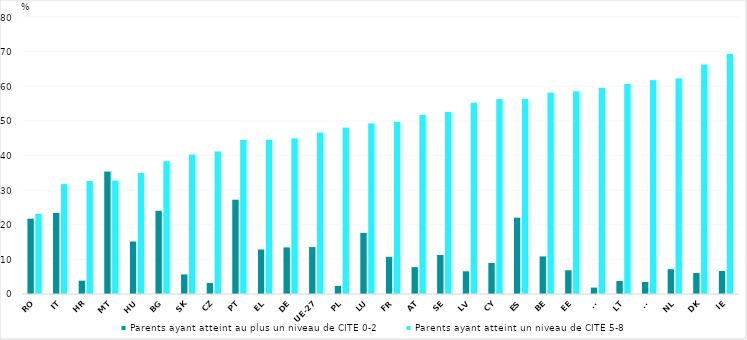
| Category | Parents ayant atteint au plus un niveau de CITE 0-2 | Parents ayant atteint un niveau de CITE 5-8 |
|---|---|---|
| RO | 21.9 | 23.3 |
| IT | 23.6 | 31.9 |
| HR | 4 | 32.8 |
| MT | 35.5 | 32.9 |
| HU | 15.3 | 35.1 |
| BG | 24.2 | 38.5 |
| SK | 5.8 | 40.4 |
| CZ | 3.3 | 41.3 |
| PT | 27.4 | 44.7 |
| EL | 13 | 44.7 |
| DE | 13.6 | 45.1 |
| UE-27 | 13.7 | 46.8 |
| PL | 2.5 | 48.2 |
| LU | 17.8 | 49.4 |
| FR | 10.9 | 49.9 |
| AT | 7.9 | 51.9 |
| SE | 11.4 | 52.7 |
| LV | 6.7 | 55.4 |
| CY | 9.1 | 56.4 |
| ES | 22.2 | 56.5 |
| BE | 11 | 58.3 |
| EE | 7 | 58.7 |
| SI | 2 | 59.7 |
| LT | 3.9 | 60.8 |
| FI | 3.6 | 61.9 |
| NL | 7.3 | 62.4 |
| DK | 6.2 | 66.4 |
| IE | 6.8 | 69.5 |